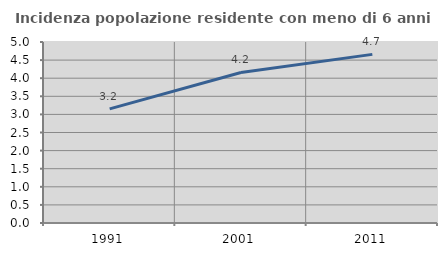
| Category | Incidenza popolazione residente con meno di 6 anni |
|---|---|
| 1991.0 | 3.152 |
| 2001.0 | 4.158 |
| 2011.0 | 4.658 |